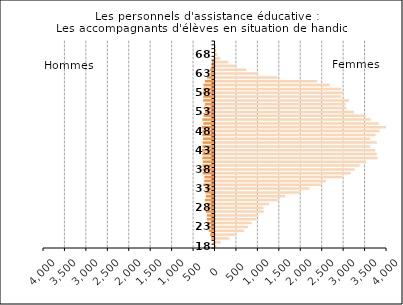
| Category | Femmes |
|---|---|
| 18.0 | 20 |
| 19.0 | 122 |
| 20.0 | 326 |
| 21.0 | 481 |
| 22.0 | 665 |
| 23.0 | 756 |
| 24.0 | 843 |
| 25.0 | 956 |
| 26.0 | 997 |
| 27.0 | 1125 |
| 28.0 | 1116 |
| 29.0 | 1246 |
| 30.0 | 1454 |
| 31.0 | 1624 |
| 32.0 | 1975 |
| 33.0 | 2187 |
| 34.0 | 2458 |
| 35.0 | 2580 |
| 36.0 | 2953 |
| 37.0 | 3153 |
| 38.0 | 3243 |
| 39.0 | 3360 |
| 40.0 | 3513 |
| 41.0 | 3783 |
| 42.0 | 3761 |
| 43.0 | 3723 |
| 44.0 | 3606 |
| 45.0 | 3762 |
| 46.0 | 3606 |
| 47.0 | 3732 |
| 48.0 | 3823 |
| 49.0 | 4036 |
| 50.0 | 3807 |
| 51.0 | 3616 |
| 52.0 | 3499 |
| 53.0 | 3230 |
| 54.0 | 3050 |
| 55.0 | 3031 |
| 56.0 | 3112 |
| 57.0 | 2934 |
| 58.0 | 2985 |
| 59.0 | 2930 |
| 60.0 | 2667 |
| 61.0 | 2372 |
| 62.0 | 1446 |
| 63.0 | 998 |
| 64.0 | 715 |
| 65.0 | 466 |
| 66.0 | 294 |
| 67.0 | 112 |
| 68.0 | 41 |
| 69.0 | 18 |
| 70.0 | 9 |
| 75.0 | 0 |